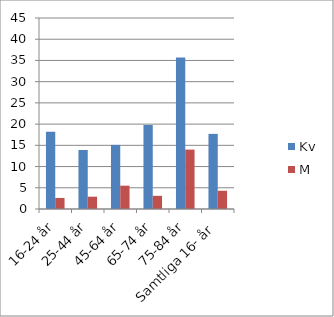
| Category | Kv | M |
|---|---|---|
| 16-24 år | 18.2 | 2.6 |
| 25-44 år | 13.9 | 2.9 |
| 45-64 år | 15.1 | 5.5 |
| 65-74 år | 19.8 | 3.1 |
| 75-84 år | 35.7 | 14 |
| Samtliga 16- år | 17.7 | 4.3 |